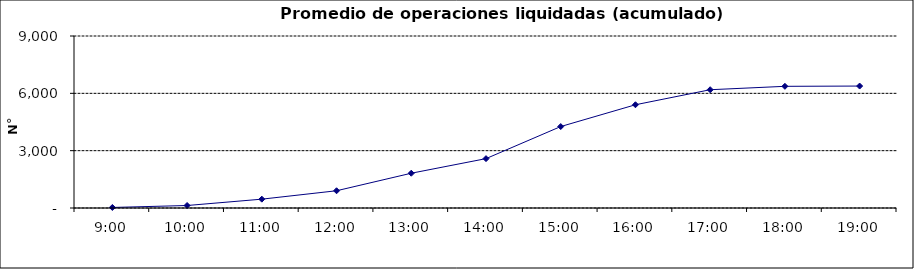
| Category | Promedio Op.Liquidadas (acumulado) |
|---|---|
| 0.375 | 28.429 |
| 0.4166666666666667 | 130.81 |
| 0.4583333333333333 | 461.952 |
| 0.5 | 902.143 |
| 0.5416666666666666 | 1819.714 |
| 0.5833333333333334 | 2582.762 |
| 0.625 | 4262.238 |
| 0.6666666666666666 | 5402.286 |
| 0.7083333333333334 | 6188.714 |
| 0.75 | 6367.095 |
| 0.7916666666666666 | 6380.81 |